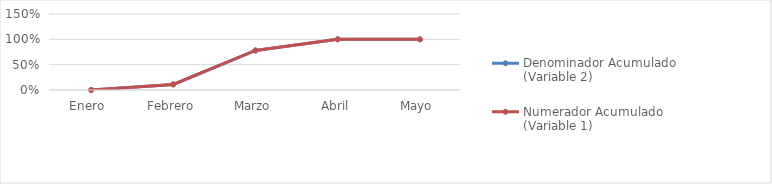
| Category | Denominador Acumulado (Variable 2) | Numerador Acumulado (Variable 1) |
|---|---|---|
| Enero  | 0 | 0 |
| Febrero | 0.11 | 0.11 |
| Marzo | 0.78 | 0.78 |
| Abril | 1 | 1 |
| Mayo | 1 | 1 |